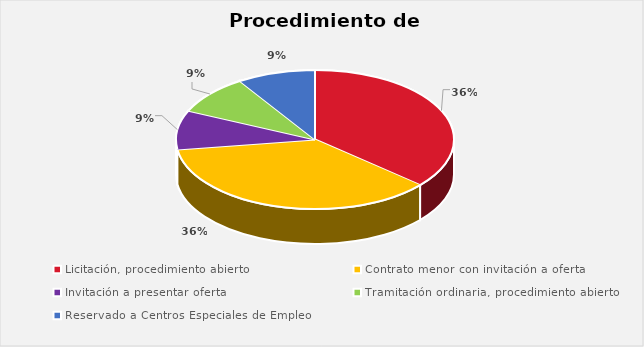
| Category | % sobre el total de contratos |
|---|---|
| Licitación, procedimiento abierto | 0.364 |
| Contrato menor con invitación a oferta | 0.364 |
| Invitación a presentar oferta | 0.091 |
| Tramitación ordinaria, procedimiento abierto | 0.091 |
| Reservado a Centros Especiales de Empleo | 0.091 |